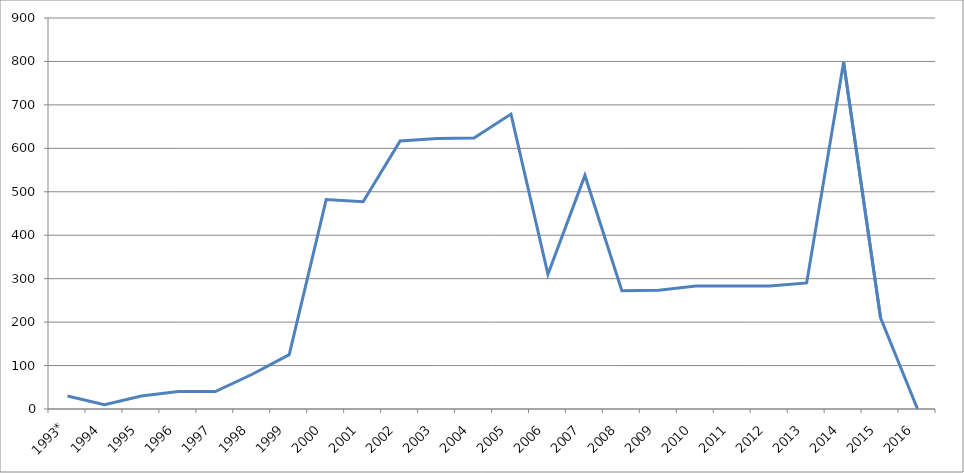
| Category | Series 0 |
|---|---|
| 1993* | 30 |
| 1994 | 10 |
| 1995 | 30 |
| 1996 | 40 |
| 1997 | 40 |
| 1998 | 80 |
| 1999 | 125 |
| 2000 | 482.1 |
| 2001 | 477 |
| 2002 | 617 |
| 2003 | 622.8 |
| 2004 | 624 |
| 2005 | 678.8 |
| 2006 | 310 |
| 2007 | 537.6 |
| 2008 | 272 |
| 2009 | 273.3 |
| 2010 | 283 |
| 2011 | 283 |
| 2012 | 283 |
| 2013 | 290.2 |
| 2014 | 798 |
| 2015 | 210 |
| 2016 | 0 |